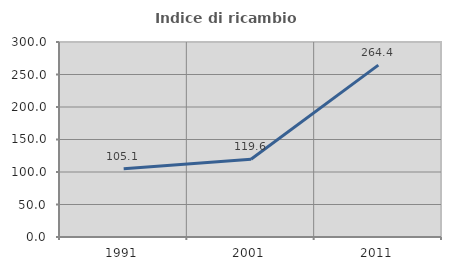
| Category | Indice di ricambio occupazionale  |
|---|---|
| 1991.0 | 105.08 |
| 2001.0 | 119.571 |
| 2011.0 | 264.4 |